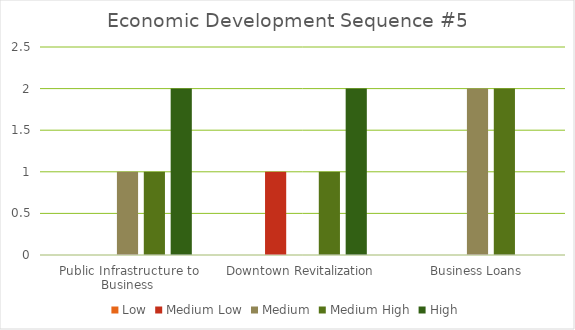
| Category | Low | Medium Low | Medium  | Medium High | High |
|---|---|---|---|---|---|
| Public Infrastructure to Business | 0 | 0 | 1 | 1 | 2 |
| Downtown Revitalization | 0 | 1 | 0 | 1 | 2 |
| Business Loans | 0 | 0 | 2 | 2 | 0 |